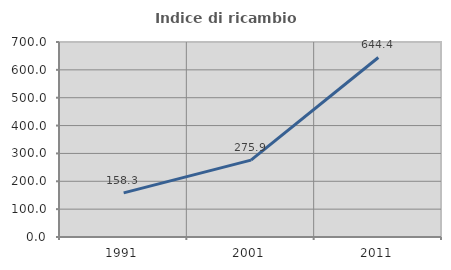
| Category | Indice di ricambio occupazionale  |
|---|---|
| 1991.0 | 158.333 |
| 2001.0 | 275.862 |
| 2011.0 | 644.444 |